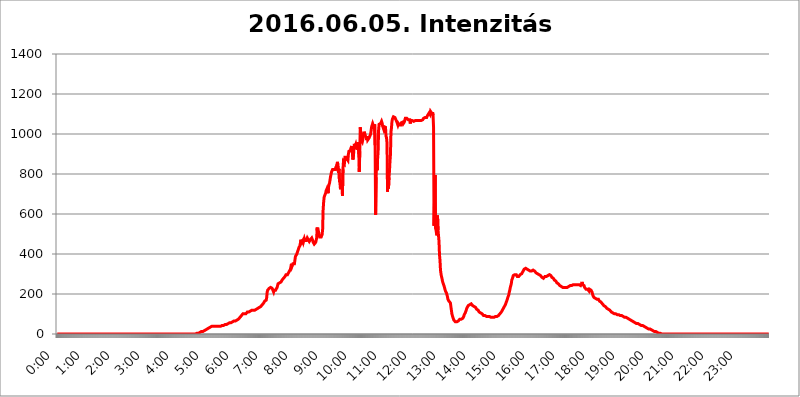
| Category | 2016.06.05. Intenzitás [W/m^2] |
|---|---|
| 0.0 | 0 |
| 0.0006944444444444445 | 0 |
| 0.001388888888888889 | 0 |
| 0.0020833333333333333 | 0 |
| 0.002777777777777778 | 0 |
| 0.003472222222222222 | 0 |
| 0.004166666666666667 | 0 |
| 0.004861111111111111 | 0 |
| 0.005555555555555556 | 0 |
| 0.0062499999999999995 | 0 |
| 0.006944444444444444 | 0 |
| 0.007638888888888889 | 0 |
| 0.008333333333333333 | 0 |
| 0.009027777777777779 | 0 |
| 0.009722222222222222 | 0 |
| 0.010416666666666666 | 0 |
| 0.011111111111111112 | 0 |
| 0.011805555555555555 | 0 |
| 0.012499999999999999 | 0 |
| 0.013194444444444444 | 0 |
| 0.013888888888888888 | 0 |
| 0.014583333333333332 | 0 |
| 0.015277777777777777 | 0 |
| 0.015972222222222224 | 0 |
| 0.016666666666666666 | 0 |
| 0.017361111111111112 | 0 |
| 0.018055555555555557 | 0 |
| 0.01875 | 0 |
| 0.019444444444444445 | 0 |
| 0.02013888888888889 | 0 |
| 0.020833333333333332 | 0 |
| 0.02152777777777778 | 0 |
| 0.022222222222222223 | 0 |
| 0.02291666666666667 | 0 |
| 0.02361111111111111 | 0 |
| 0.024305555555555556 | 0 |
| 0.024999999999999998 | 0 |
| 0.025694444444444447 | 0 |
| 0.02638888888888889 | 0 |
| 0.027083333333333334 | 0 |
| 0.027777777777777776 | 0 |
| 0.02847222222222222 | 0 |
| 0.029166666666666664 | 0 |
| 0.029861111111111113 | 0 |
| 0.030555555555555555 | 0 |
| 0.03125 | 0 |
| 0.03194444444444445 | 0 |
| 0.03263888888888889 | 0 |
| 0.03333333333333333 | 0 |
| 0.034027777777777775 | 0 |
| 0.034722222222222224 | 0 |
| 0.035416666666666666 | 0 |
| 0.036111111111111115 | 0 |
| 0.03680555555555556 | 0 |
| 0.0375 | 0 |
| 0.03819444444444444 | 0 |
| 0.03888888888888889 | 0 |
| 0.03958333333333333 | 0 |
| 0.04027777777777778 | 0 |
| 0.04097222222222222 | 0 |
| 0.041666666666666664 | 0 |
| 0.042361111111111106 | 0 |
| 0.04305555555555556 | 0 |
| 0.043750000000000004 | 0 |
| 0.044444444444444446 | 0 |
| 0.04513888888888889 | 0 |
| 0.04583333333333334 | 0 |
| 0.04652777777777778 | 0 |
| 0.04722222222222222 | 0 |
| 0.04791666666666666 | 0 |
| 0.04861111111111111 | 0 |
| 0.049305555555555554 | 0 |
| 0.049999999999999996 | 0 |
| 0.05069444444444445 | 0 |
| 0.051388888888888894 | 0 |
| 0.052083333333333336 | 0 |
| 0.05277777777777778 | 0 |
| 0.05347222222222222 | 0 |
| 0.05416666666666667 | 0 |
| 0.05486111111111111 | 0 |
| 0.05555555555555555 | 0 |
| 0.05625 | 0 |
| 0.05694444444444444 | 0 |
| 0.057638888888888885 | 0 |
| 0.05833333333333333 | 0 |
| 0.05902777777777778 | 0 |
| 0.059722222222222225 | 0 |
| 0.06041666666666667 | 0 |
| 0.061111111111111116 | 0 |
| 0.06180555555555556 | 0 |
| 0.0625 | 0 |
| 0.06319444444444444 | 0 |
| 0.06388888888888888 | 0 |
| 0.06458333333333334 | 0 |
| 0.06527777777777778 | 0 |
| 0.06597222222222222 | 0 |
| 0.06666666666666667 | 0 |
| 0.06736111111111111 | 0 |
| 0.06805555555555555 | 0 |
| 0.06874999999999999 | 0 |
| 0.06944444444444443 | 0 |
| 0.07013888888888889 | 0 |
| 0.07083333333333333 | 0 |
| 0.07152777777777779 | 0 |
| 0.07222222222222223 | 0 |
| 0.07291666666666667 | 0 |
| 0.07361111111111111 | 0 |
| 0.07430555555555556 | 0 |
| 0.075 | 0 |
| 0.07569444444444444 | 0 |
| 0.0763888888888889 | 0 |
| 0.07708333333333334 | 0 |
| 0.07777777777777778 | 0 |
| 0.07847222222222222 | 0 |
| 0.07916666666666666 | 0 |
| 0.0798611111111111 | 0 |
| 0.08055555555555556 | 0 |
| 0.08125 | 0 |
| 0.08194444444444444 | 0 |
| 0.08263888888888889 | 0 |
| 0.08333333333333333 | 0 |
| 0.08402777777777777 | 0 |
| 0.08472222222222221 | 0 |
| 0.08541666666666665 | 0 |
| 0.08611111111111112 | 0 |
| 0.08680555555555557 | 0 |
| 0.08750000000000001 | 0 |
| 0.08819444444444445 | 0 |
| 0.08888888888888889 | 0 |
| 0.08958333333333333 | 0 |
| 0.09027777777777778 | 0 |
| 0.09097222222222222 | 0 |
| 0.09166666666666667 | 0 |
| 0.09236111111111112 | 0 |
| 0.09305555555555556 | 0 |
| 0.09375 | 0 |
| 0.09444444444444444 | 0 |
| 0.09513888888888888 | 0 |
| 0.09583333333333333 | 0 |
| 0.09652777777777777 | 0 |
| 0.09722222222222222 | 0 |
| 0.09791666666666667 | 0 |
| 0.09861111111111111 | 0 |
| 0.09930555555555555 | 0 |
| 0.09999999999999999 | 0 |
| 0.10069444444444443 | 0 |
| 0.1013888888888889 | 0 |
| 0.10208333333333335 | 0 |
| 0.10277777777777779 | 0 |
| 0.10347222222222223 | 0 |
| 0.10416666666666667 | 0 |
| 0.10486111111111111 | 0 |
| 0.10555555555555556 | 0 |
| 0.10625 | 0 |
| 0.10694444444444444 | 0 |
| 0.1076388888888889 | 0 |
| 0.10833333333333334 | 0 |
| 0.10902777777777778 | 0 |
| 0.10972222222222222 | 0 |
| 0.1111111111111111 | 0 |
| 0.11180555555555556 | 0 |
| 0.11180555555555556 | 0 |
| 0.1125 | 0 |
| 0.11319444444444444 | 0 |
| 0.11388888888888889 | 0 |
| 0.11458333333333333 | 0 |
| 0.11527777777777777 | 0 |
| 0.11597222222222221 | 0 |
| 0.11666666666666665 | 0 |
| 0.1173611111111111 | 0 |
| 0.11805555555555557 | 0 |
| 0.11944444444444445 | 0 |
| 0.12013888888888889 | 0 |
| 0.12083333333333333 | 0 |
| 0.12152777777777778 | 0 |
| 0.12222222222222223 | 0 |
| 0.12291666666666667 | 0 |
| 0.12291666666666667 | 0 |
| 0.12361111111111112 | 0 |
| 0.12430555555555556 | 0 |
| 0.125 | 0 |
| 0.12569444444444444 | 0 |
| 0.12638888888888888 | 0 |
| 0.12708333333333333 | 0 |
| 0.16875 | 0 |
| 0.12847222222222224 | 0 |
| 0.12916666666666668 | 0 |
| 0.12986111111111112 | 0 |
| 0.13055555555555556 | 0 |
| 0.13125 | 0 |
| 0.13194444444444445 | 0 |
| 0.1326388888888889 | 0 |
| 0.13333333333333333 | 0 |
| 0.13402777777777777 | 0 |
| 0.13402777777777777 | 0 |
| 0.13472222222222222 | 0 |
| 0.13541666666666666 | 0 |
| 0.1361111111111111 | 0 |
| 0.13749999999999998 | 0 |
| 0.13819444444444443 | 0 |
| 0.1388888888888889 | 0 |
| 0.13958333333333334 | 0 |
| 0.14027777777777778 | 0 |
| 0.14097222222222222 | 0 |
| 0.14166666666666666 | 0 |
| 0.1423611111111111 | 0 |
| 0.14305555555555557 | 0 |
| 0.14375000000000002 | 0 |
| 0.14444444444444446 | 0 |
| 0.1451388888888889 | 0 |
| 0.1451388888888889 | 0 |
| 0.14652777777777778 | 0 |
| 0.14722222222222223 | 0 |
| 0.14791666666666667 | 0 |
| 0.1486111111111111 | 0 |
| 0.14930555555555555 | 0 |
| 0.15 | 0 |
| 0.15069444444444444 | 0 |
| 0.15138888888888888 | 0 |
| 0.15208333333333332 | 0 |
| 0.15277777777777776 | 0 |
| 0.15347222222222223 | 0 |
| 0.15416666666666667 | 0 |
| 0.15486111111111112 | 0 |
| 0.15555555555555556 | 0 |
| 0.15625 | 0 |
| 0.15694444444444444 | 0 |
| 0.15763888888888888 | 0 |
| 0.15833333333333333 | 0 |
| 0.15902777777777777 | 0 |
| 0.15972222222222224 | 0 |
| 0.16041666666666668 | 0 |
| 0.16111111111111112 | 0 |
| 0.16180555555555556 | 0 |
| 0.1625 | 0 |
| 0.16319444444444445 | 0 |
| 0.1638888888888889 | 0 |
| 0.16458333333333333 | 0 |
| 0.16527777777777777 | 0 |
| 0.16597222222222222 | 0 |
| 0.16666666666666666 | 0 |
| 0.1673611111111111 | 0 |
| 0.16805555555555554 | 0 |
| 0.16874999999999998 | 0 |
| 0.16944444444444443 | 0 |
| 0.17013888888888887 | 0 |
| 0.1708333333333333 | 0 |
| 0.17152777777777775 | 0 |
| 0.17222222222222225 | 0 |
| 0.1729166666666667 | 0 |
| 0.17361111111111113 | 0 |
| 0.17430555555555557 | 0 |
| 0.17500000000000002 | 0 |
| 0.17569444444444446 | 0 |
| 0.1763888888888889 | 0 |
| 0.17708333333333334 | 0 |
| 0.17777777777777778 | 0 |
| 0.17847222222222223 | 0 |
| 0.17916666666666667 | 0 |
| 0.1798611111111111 | 0 |
| 0.18055555555555555 | 0 |
| 0.18125 | 0 |
| 0.18194444444444444 | 0 |
| 0.1826388888888889 | 0 |
| 0.18333333333333335 | 0 |
| 0.1840277777777778 | 0 |
| 0.18472222222222223 | 0 |
| 0.18541666666666667 | 0 |
| 0.18611111111111112 | 0 |
| 0.18680555555555556 | 0 |
| 0.1875 | 0 |
| 0.18819444444444444 | 0 |
| 0.18888888888888888 | 0 |
| 0.18958333333333333 | 0 |
| 0.19027777777777777 | 0 |
| 0.1909722222222222 | 0 |
| 0.19166666666666665 | 0 |
| 0.19236111111111112 | 0 |
| 0.19305555555555554 | 0 |
| 0.19375 | 0 |
| 0.19444444444444445 | 0 |
| 0.1951388888888889 | 3.525 |
| 0.19583333333333333 | 3.525 |
| 0.19652777777777777 | 3.525 |
| 0.19722222222222222 | 3.525 |
| 0.19791666666666666 | 3.525 |
| 0.1986111111111111 | 3.525 |
| 0.19930555555555554 | 3.525 |
| 0.19999999999999998 | 7.887 |
| 0.20069444444444443 | 7.887 |
| 0.20138888888888887 | 7.887 |
| 0.2020833333333333 | 12.257 |
| 0.2027777777777778 | 12.257 |
| 0.2034722222222222 | 12.257 |
| 0.2041666666666667 | 12.257 |
| 0.20486111111111113 | 12.257 |
| 0.20555555555555557 | 16.636 |
| 0.20625000000000002 | 16.636 |
| 0.20694444444444446 | 16.636 |
| 0.2076388888888889 | 21.024 |
| 0.20833333333333334 | 21.024 |
| 0.20902777777777778 | 21.024 |
| 0.20972222222222223 | 21.024 |
| 0.21041666666666667 | 25.419 |
| 0.2111111111111111 | 25.419 |
| 0.21180555555555555 | 25.419 |
| 0.2125 | 29.823 |
| 0.21319444444444444 | 29.823 |
| 0.2138888888888889 | 29.823 |
| 0.21458333333333335 | 34.234 |
| 0.2152777777777778 | 34.234 |
| 0.21597222222222223 | 34.234 |
| 0.21666666666666667 | 38.653 |
| 0.21736111111111112 | 38.653 |
| 0.21805555555555556 | 38.653 |
| 0.21875 | 38.653 |
| 0.21944444444444444 | 38.653 |
| 0.22013888888888888 | 38.653 |
| 0.22083333333333333 | 38.653 |
| 0.22152777777777777 | 38.653 |
| 0.2222222222222222 | 38.653 |
| 0.22291666666666665 | 38.653 |
| 0.2236111111111111 | 38.653 |
| 0.22430555555555556 | 38.653 |
| 0.225 | 38.653 |
| 0.22569444444444445 | 38.653 |
| 0.2263888888888889 | 38.653 |
| 0.22708333333333333 | 38.653 |
| 0.22777777777777777 | 38.653 |
| 0.22847222222222222 | 38.653 |
| 0.22916666666666666 | 38.653 |
| 0.2298611111111111 | 38.653 |
| 0.23055555555555554 | 38.653 |
| 0.23124999999999998 | 43.079 |
| 0.23194444444444443 | 43.079 |
| 0.23263888888888887 | 43.079 |
| 0.2333333333333333 | 43.079 |
| 0.2340277777777778 | 43.079 |
| 0.2347222222222222 | 43.079 |
| 0.2354166666666667 | 47.511 |
| 0.23611111111111113 | 47.511 |
| 0.23680555555555557 | 47.511 |
| 0.23750000000000002 | 47.511 |
| 0.23819444444444446 | 51.951 |
| 0.2388888888888889 | 51.951 |
| 0.23958333333333334 | 51.951 |
| 0.24027777777777778 | 51.951 |
| 0.24097222222222223 | 56.398 |
| 0.24166666666666667 | 56.398 |
| 0.2423611111111111 | 56.398 |
| 0.24305555555555555 | 56.398 |
| 0.24375 | 56.398 |
| 0.24444444444444446 | 56.398 |
| 0.24513888888888888 | 60.85 |
| 0.24583333333333335 | 60.85 |
| 0.2465277777777778 | 60.85 |
| 0.24722222222222223 | 60.85 |
| 0.24791666666666667 | 65.31 |
| 0.24861111111111112 | 65.31 |
| 0.24930555555555556 | 65.31 |
| 0.25 | 65.31 |
| 0.25069444444444444 | 65.31 |
| 0.2513888888888889 | 65.31 |
| 0.2520833333333333 | 69.775 |
| 0.25277777777777777 | 69.775 |
| 0.2534722222222222 | 74.246 |
| 0.25416666666666665 | 74.246 |
| 0.2548611111111111 | 78.722 |
| 0.2555555555555556 | 78.722 |
| 0.25625000000000003 | 83.205 |
| 0.2569444444444445 | 83.205 |
| 0.2576388888888889 | 87.692 |
| 0.25833333333333336 | 92.184 |
| 0.2590277777777778 | 92.184 |
| 0.25972222222222224 | 96.682 |
| 0.2604166666666667 | 101.184 |
| 0.2611111111111111 | 101.184 |
| 0.26180555555555557 | 105.69 |
| 0.2625 | 101.184 |
| 0.26319444444444445 | 101.184 |
| 0.2638888888888889 | 101.184 |
| 0.26458333333333334 | 101.184 |
| 0.2652777777777778 | 105.69 |
| 0.2659722222222222 | 105.69 |
| 0.26666666666666666 | 110.201 |
| 0.2673611111111111 | 110.201 |
| 0.26805555555555555 | 110.201 |
| 0.26875 | 110.201 |
| 0.26944444444444443 | 114.716 |
| 0.2701388888888889 | 114.716 |
| 0.2708333333333333 | 114.716 |
| 0.27152777777777776 | 119.235 |
| 0.2722222222222222 | 119.235 |
| 0.27291666666666664 | 119.235 |
| 0.2736111111111111 | 119.235 |
| 0.2743055555555555 | 119.235 |
| 0.27499999999999997 | 119.235 |
| 0.27569444444444446 | 119.235 |
| 0.27638888888888885 | 119.235 |
| 0.27708333333333335 | 119.235 |
| 0.2777777777777778 | 119.235 |
| 0.27847222222222223 | 119.235 |
| 0.2791666666666667 | 123.758 |
| 0.2798611111111111 | 123.758 |
| 0.28055555555555556 | 128.284 |
| 0.28125 | 128.284 |
| 0.28194444444444444 | 128.284 |
| 0.2826388888888889 | 128.284 |
| 0.2833333333333333 | 132.814 |
| 0.28402777777777777 | 132.814 |
| 0.2847222222222222 | 137.347 |
| 0.28541666666666665 | 137.347 |
| 0.28611111111111115 | 141.884 |
| 0.28680555555555554 | 141.884 |
| 0.28750000000000003 | 146.423 |
| 0.2881944444444445 | 146.423 |
| 0.2888888888888889 | 150.964 |
| 0.28958333333333336 | 155.509 |
| 0.2902777777777778 | 155.509 |
| 0.29097222222222224 | 164.605 |
| 0.2916666666666667 | 160.056 |
| 0.2923611111111111 | 164.605 |
| 0.29305555555555557 | 169.156 |
| 0.29375 | 182.82 |
| 0.29444444444444445 | 210.182 |
| 0.2951388888888889 | 219.309 |
| 0.29583333333333334 | 219.309 |
| 0.2965277777777778 | 223.873 |
| 0.2972222222222222 | 228.436 |
| 0.29791666666666666 | 233 |
| 0.2986111111111111 | 233 |
| 0.29930555555555555 | 233 |
| 0.3 | 228.436 |
| 0.30069444444444443 | 228.436 |
| 0.3013888888888889 | 228.436 |
| 0.3020833333333333 | 228.436 |
| 0.30277777777777776 | 223.873 |
| 0.3034722222222222 | 210.182 |
| 0.30416666666666664 | 219.309 |
| 0.3048611111111111 | 214.746 |
| 0.3055555555555555 | 219.309 |
| 0.30624999999999997 | 219.309 |
| 0.3069444444444444 | 219.309 |
| 0.3076388888888889 | 223.873 |
| 0.30833333333333335 | 233 |
| 0.3090277777777778 | 242.127 |
| 0.30972222222222223 | 251.251 |
| 0.3104166666666667 | 255.813 |
| 0.3111111111111111 | 255.813 |
| 0.31180555555555556 | 255.813 |
| 0.3125 | 255.813 |
| 0.31319444444444444 | 255.813 |
| 0.3138888888888889 | 260.373 |
| 0.3145833333333333 | 264.932 |
| 0.31527777777777777 | 269.49 |
| 0.3159722222222222 | 274.047 |
| 0.31666666666666665 | 274.047 |
| 0.31736111111111115 | 278.603 |
| 0.31805555555555554 | 278.603 |
| 0.31875000000000003 | 283.156 |
| 0.3194444444444445 | 287.709 |
| 0.3201388888888889 | 292.259 |
| 0.32083333333333336 | 296.808 |
| 0.3215277777777778 | 296.808 |
| 0.32222222222222224 | 296.808 |
| 0.3229166666666667 | 296.808 |
| 0.3236111111111111 | 301.354 |
| 0.32430555555555557 | 305.898 |
| 0.325 | 305.898 |
| 0.32569444444444445 | 314.98 |
| 0.3263888888888889 | 319.517 |
| 0.32708333333333334 | 324.052 |
| 0.3277777777777778 | 337.639 |
| 0.3284722222222222 | 351.198 |
| 0.32916666666666666 | 337.639 |
| 0.3298611111111111 | 342.162 |
| 0.33055555555555555 | 351.198 |
| 0.33125 | 351.198 |
| 0.33194444444444443 | 351.198 |
| 0.3326388888888889 | 351.198 |
| 0.3333333333333333 | 369.23 |
| 0.3340277777777778 | 387.202 |
| 0.3347222222222222 | 391.685 |
| 0.3354166666666667 | 387.202 |
| 0.3361111111111111 | 400.638 |
| 0.3368055555555556 | 409.574 |
| 0.33749999999999997 | 414.035 |
| 0.33819444444444446 | 422.943 |
| 0.33888888888888885 | 431.833 |
| 0.33958333333333335 | 436.27 |
| 0.34027777777777773 | 440.702 |
| 0.34097222222222223 | 453.968 |
| 0.3416666666666666 | 471.582 |
| 0.3423611111111111 | 471.582 |
| 0.3430555555555555 | 458.38 |
| 0.34375 | 458.38 |
| 0.3444444444444445 | 467.187 |
| 0.3451388888888889 | 458.38 |
| 0.3458333333333334 | 462.786 |
| 0.34652777777777777 | 475.972 |
| 0.34722222222222227 | 467.187 |
| 0.34791666666666665 | 462.786 |
| 0.34861111111111115 | 462.786 |
| 0.34930555555555554 | 467.187 |
| 0.35000000000000003 | 471.582 |
| 0.3506944444444444 | 480.356 |
| 0.3513888888888889 | 475.972 |
| 0.3520833333333333 | 471.582 |
| 0.3527777777777778 | 471.582 |
| 0.3534722222222222 | 462.786 |
| 0.3541666666666667 | 462.786 |
| 0.3548611111111111 | 471.582 |
| 0.35555555555555557 | 467.187 |
| 0.35625 | 471.582 |
| 0.35694444444444445 | 480.356 |
| 0.3576388888888889 | 475.972 |
| 0.35833333333333334 | 467.187 |
| 0.3590277777777778 | 458.38 |
| 0.3597222222222222 | 453.968 |
| 0.36041666666666666 | 449.551 |
| 0.3611111111111111 | 449.551 |
| 0.36180555555555555 | 449.551 |
| 0.3625 | 458.38 |
| 0.36319444444444443 | 462.786 |
| 0.3638888888888889 | 480.356 |
| 0.3645833333333333 | 532.513 |
| 0.3652777777777778 | 493.475 |
| 0.3659722222222222 | 493.475 |
| 0.3666666666666667 | 506.542 |
| 0.3673611111111111 | 493.475 |
| 0.3680555555555556 | 484.735 |
| 0.36874999999999997 | 480.356 |
| 0.36944444444444446 | 480.356 |
| 0.37013888888888885 | 484.735 |
| 0.37083333333333335 | 489.108 |
| 0.37152777777777773 | 497.836 |
| 0.37222222222222223 | 523.88 |
| 0.3729166666666666 | 621.613 |
| 0.3736111111111111 | 658.909 |
| 0.3743055555555555 | 683.473 |
| 0.375 | 691.608 |
| 0.3756944444444445 | 695.666 |
| 0.3763888888888889 | 703.762 |
| 0.3770833333333334 | 715.858 |
| 0.37777777777777777 | 715.858 |
| 0.37847222222222227 | 727.896 |
| 0.37916666666666665 | 719.877 |
| 0.37986111111111115 | 703.762 |
| 0.38055555555555554 | 735.89 |
| 0.38125000000000003 | 747.834 |
| 0.3819444444444444 | 755.766 |
| 0.3826388888888889 | 771.559 |
| 0.3833333333333333 | 787.258 |
| 0.3840277777777778 | 798.974 |
| 0.3847222222222222 | 810.641 |
| 0.3854166666666667 | 814.519 |
| 0.3861111111111111 | 822.26 |
| 0.38680555555555557 | 822.26 |
| 0.3875 | 826.123 |
| 0.38819444444444445 | 822.26 |
| 0.3888888888888889 | 822.26 |
| 0.38958333333333334 | 822.26 |
| 0.3902777777777778 | 822.26 |
| 0.3909722222222222 | 837.682 |
| 0.39166666666666666 | 829.981 |
| 0.3923611111111111 | 849.199 |
| 0.39305555555555555 | 860.676 |
| 0.39375 | 860.676 |
| 0.39444444444444443 | 806.757 |
| 0.3951388888888889 | 826.123 |
| 0.3958333333333333 | 763.674 |
| 0.3965277777777778 | 755.766 |
| 0.3972222222222222 | 723.889 |
| 0.3979166666666667 | 767.62 |
| 0.3986111111111111 | 767.62 |
| 0.3993055555555556 | 743.859 |
| 0.39999999999999997 | 691.608 |
| 0.40069444444444446 | 822.26 |
| 0.40138888888888885 | 860.676 |
| 0.40208333333333335 | 860.676 |
| 0.40277777777777773 | 853.029 |
| 0.40347222222222223 | 883.516 |
| 0.4041666666666666 | 883.516 |
| 0.4048611111111111 | 879.719 |
| 0.4055555555555555 | 883.516 |
| 0.40625 | 875.918 |
| 0.4069444444444445 | 872.114 |
| 0.4076388888888889 | 868.305 |
| 0.4083333333333334 | 898.668 |
| 0.40902777777777777 | 913.766 |
| 0.40972222222222227 | 909.996 |
| 0.41041666666666665 | 917.534 |
| 0.41111111111111115 | 917.534 |
| 0.41180555555555554 | 928.819 |
| 0.41250000000000003 | 928.819 |
| 0.4131944444444444 | 940.082 |
| 0.4138888888888889 | 906.223 |
| 0.4145833333333333 | 872.114 |
| 0.4152777777777778 | 883.516 |
| 0.4159722222222222 | 879.719 |
| 0.4166666666666667 | 951.327 |
| 0.4173611111111111 | 947.58 |
| 0.41805555555555557 | 940.082 |
| 0.41875 | 947.58 |
| 0.41944444444444445 | 936.33 |
| 0.4201388888888889 | 928.819 |
| 0.42083333333333334 | 955.071 |
| 0.4215277777777778 | 921.298 |
| 0.4222222222222222 | 958.814 |
| 0.42291666666666666 | 898.668 |
| 0.4236111111111111 | 810.641 |
| 0.42430555555555555 | 913.766 |
| 0.425 | 1033.537 |
| 0.42569444444444443 | 1003.65 |
| 0.4263888888888889 | 966.295 |
| 0.4270833333333333 | 970.034 |
| 0.4277777777777778 | 958.814 |
| 0.4284722222222222 | 970.034 |
| 0.4291666666666667 | 1003.65 |
| 0.4298611111111111 | 996.182 |
| 0.4305555555555556 | 1011.118 |
| 0.43124999999999997 | 1003.65 |
| 0.43194444444444446 | 1007.383 |
| 0.43263888888888885 | 984.98 |
| 0.43333333333333335 | 977.508 |
| 0.43402777777777773 | 970.034 |
| 0.43472222222222223 | 988.714 |
| 0.4354166666666666 | 970.034 |
| 0.4361111111111111 | 970.034 |
| 0.4368055555555555 | 973.772 |
| 0.4375 | 981.244 |
| 0.4381944444444445 | 977.508 |
| 0.4388888888888889 | 981.244 |
| 0.4395833333333334 | 999.916 |
| 0.44027777777777777 | 999.916 |
| 0.44097222222222227 | 1037.277 |
| 0.44166666666666665 | 1033.537 |
| 0.44236111111111115 | 1052.255 |
| 0.44305555555555554 | 1048.508 |
| 0.44375000000000003 | 1037.277 |
| 0.4444444444444444 | 1041.019 |
| 0.4451388888888889 | 1048.508 |
| 0.4458333333333333 | 943.832 |
| 0.4465277777777778 | 596.45 |
| 0.4472222222222222 | 783.342 |
| 0.4479166666666667 | 860.676 |
| 0.4486111111111111 | 818.392 |
| 0.44930555555555557 | 875.918 |
| 0.45 | 909.996 |
| 0.45069444444444445 | 1018.587 |
| 0.4513888888888889 | 1048.508 |
| 0.45208333333333334 | 1052.255 |
| 0.4527777777777778 | 1052.255 |
| 0.4534722222222222 | 1052.255 |
| 0.45416666666666666 | 1056.004 |
| 0.4548611111111111 | 1063.51 |
| 0.45555555555555555 | 1056.004 |
| 0.45625 | 1041.019 |
| 0.45694444444444443 | 1037.277 |
| 0.4576388888888889 | 1026.06 |
| 0.4583333333333333 | 1037.277 |
| 0.4590277777777778 | 1033.537 |
| 0.4597222222222222 | 1033.537 |
| 0.4604166666666667 | 1033.537 |
| 0.4611111111111111 | 988.714 |
| 0.4618055555555556 | 981.244 |
| 0.46249999999999997 | 955.071 |
| 0.46319444444444446 | 711.832 |
| 0.46388888888888885 | 771.559 |
| 0.46458333333333335 | 727.896 |
| 0.46527777777777773 | 783.342 |
| 0.46597222222222223 | 814.519 |
| 0.4666666666666666 | 864.493 |
| 0.4673611111111111 | 898.668 |
| 0.4680555555555555 | 1011.118 |
| 0.46875 | 1029.798 |
| 0.4694444444444445 | 1063.51 |
| 0.4701388888888889 | 1074.789 |
| 0.4708333333333334 | 1074.789 |
| 0.47152777777777777 | 1086.097 |
| 0.47222222222222227 | 1086.097 |
| 0.47291666666666665 | 1086.097 |
| 0.47361111111111115 | 1082.324 |
| 0.47430555555555554 | 1078.555 |
| 0.47500000000000003 | 1071.027 |
| 0.4756944444444444 | 1067.267 |
| 0.4763888888888889 | 1059.756 |
| 0.4770833333333333 | 1056.004 |
| 0.4777777777777778 | 1044.762 |
| 0.4784722222222222 | 1052.255 |
| 0.4791666666666667 | 1052.255 |
| 0.4798611111111111 | 1044.762 |
| 0.48055555555555557 | 1048.508 |
| 0.48125 | 1041.019 |
| 0.48194444444444445 | 1044.762 |
| 0.4826388888888889 | 1056.004 |
| 0.48333333333333334 | 1059.756 |
| 0.4840277777777778 | 1059.756 |
| 0.4847222222222222 | 1059.756 |
| 0.48541666666666666 | 1052.255 |
| 0.4861111111111111 | 1056.004 |
| 0.48680555555555555 | 1059.756 |
| 0.4875 | 1059.756 |
| 0.48819444444444443 | 1078.555 |
| 0.4888888888888889 | 1078.555 |
| 0.4895833333333333 | 1078.555 |
| 0.4902777777777778 | 1078.555 |
| 0.4909722222222222 | 1078.555 |
| 0.4916666666666667 | 1078.555 |
| 0.4923611111111111 | 1071.027 |
| 0.4930555555555556 | 1067.267 |
| 0.49374999999999997 | 1074.789 |
| 0.49444444444444446 | 1071.027 |
| 0.49513888888888885 | 1052.255 |
| 0.49583333333333335 | 1067.267 |
| 0.49652777777777773 | 1063.51 |
| 0.49722222222222223 | 1063.51 |
| 0.4979166666666666 | 1067.267 |
| 0.4986111111111111 | 1067.267 |
| 0.4993055555555555 | 1067.267 |
| 0.5 | 1063.51 |
| 0.5006944444444444 | 1067.267 |
| 0.5013888888888889 | 1063.51 |
| 0.5020833333333333 | 1067.267 |
| 0.5027777777777778 | 1071.027 |
| 0.5034722222222222 | 1071.027 |
| 0.5041666666666667 | 1067.267 |
| 0.5048611111111111 | 1067.267 |
| 0.5055555555555555 | 1067.267 |
| 0.50625 | 1067.267 |
| 0.5069444444444444 | 1067.267 |
| 0.5076388888888889 | 1067.267 |
| 0.5083333333333333 | 1067.267 |
| 0.5090277777777777 | 1063.51 |
| 0.5097222222222222 | 1067.267 |
| 0.5104166666666666 | 1067.267 |
| 0.5111111111111112 | 1067.267 |
| 0.5118055555555555 | 1067.267 |
| 0.5125000000000001 | 1071.027 |
| 0.5131944444444444 | 1074.789 |
| 0.513888888888889 | 1078.555 |
| 0.5145833333333333 | 1082.324 |
| 0.5152777777777778 | 1082.324 |
| 0.5159722222222222 | 1082.324 |
| 0.5166666666666667 | 1086.097 |
| 0.517361111111111 | 1086.097 |
| 0.5180555555555556 | 1082.324 |
| 0.5187499999999999 | 1086.097 |
| 0.5194444444444445 | 1093.653 |
| 0.5201388888888888 | 1097.437 |
| 0.5208333333333334 | 1097.437 |
| 0.5215277777777778 | 1105.019 |
| 0.5222222222222223 | 1101.226 |
| 0.5229166666666667 | 1097.437 |
| 0.5236111111111111 | 1112.618 |
| 0.5243055555555556 | 1108.816 |
| 0.525 | 1105.019 |
| 0.5256944444444445 | 1093.653 |
| 0.5263888888888889 | 1108.816 |
| 0.5270833333333333 | 1093.653 |
| 0.5277777777777778 | 1033.537 |
| 0.5284722222222222 | 541.121 |
| 0.5291666666666667 | 541.121 |
| 0.5298611111111111 | 795.074 |
| 0.5305555555555556 | 528.2 |
| 0.53125 | 519.555 |
| 0.5319444444444444 | 502.192 |
| 0.5326388888888889 | 493.475 |
| 0.5333333333333333 | 592.233 |
| 0.5340277777777778 | 519.555 |
| 0.5347222222222222 | 493.475 |
| 0.5354166666666667 | 462.786 |
| 0.5361111111111111 | 396.164 |
| 0.5368055555555555 | 369.23 |
| 0.5375 | 319.517 |
| 0.5381944444444444 | 301.354 |
| 0.5388888888888889 | 287.709 |
| 0.5395833333333333 | 278.603 |
| 0.5402777777777777 | 264.932 |
| 0.5409722222222222 | 255.813 |
| 0.5416666666666666 | 251.251 |
| 0.5423611111111112 | 242.127 |
| 0.5430555555555555 | 233 |
| 0.5437500000000001 | 223.873 |
| 0.5444444444444444 | 214.746 |
| 0.545138888888889 | 210.182 |
| 0.5458333333333333 | 205.62 |
| 0.5465277777777778 | 196.497 |
| 0.5472222222222222 | 187.378 |
| 0.5479166666666667 | 173.709 |
| 0.548611111111111 | 169.156 |
| 0.5493055555555556 | 164.605 |
| 0.5499999999999999 | 164.605 |
| 0.5506944444444445 | 164.605 |
| 0.5513888888888888 | 155.509 |
| 0.5520833333333334 | 137.347 |
| 0.5527777777777778 | 119.235 |
| 0.5534722222222223 | 101.184 |
| 0.5541666666666667 | 92.184 |
| 0.5548611111111111 | 83.205 |
| 0.5555555555555556 | 78.722 |
| 0.55625 | 69.775 |
| 0.5569444444444445 | 65.31 |
| 0.5576388888888889 | 65.31 |
| 0.5583333333333333 | 60.85 |
| 0.5590277777777778 | 56.398 |
| 0.5597222222222222 | 60.85 |
| 0.5604166666666667 | 60.85 |
| 0.5611111111111111 | 60.85 |
| 0.5618055555555556 | 65.31 |
| 0.5625 | 65.31 |
| 0.5631944444444444 | 69.775 |
| 0.5638888888888889 | 69.775 |
| 0.5645833333333333 | 74.246 |
| 0.5652777777777778 | 74.246 |
| 0.5659722222222222 | 74.246 |
| 0.5666666666666667 | 74.246 |
| 0.5673611111111111 | 74.246 |
| 0.5680555555555555 | 78.722 |
| 0.56875 | 78.722 |
| 0.5694444444444444 | 83.205 |
| 0.5701388888888889 | 87.692 |
| 0.5708333333333333 | 96.682 |
| 0.5715277777777777 | 101.184 |
| 0.5722222222222222 | 105.69 |
| 0.5729166666666666 | 110.201 |
| 0.5736111111111112 | 119.235 |
| 0.5743055555555555 | 128.284 |
| 0.5750000000000001 | 132.814 |
| 0.5756944444444444 | 132.814 |
| 0.576388888888889 | 141.884 |
| 0.5770833333333333 | 146.423 |
| 0.5777777777777778 | 146.423 |
| 0.5784722222222222 | 146.423 |
| 0.5791666666666667 | 146.423 |
| 0.579861111111111 | 150.964 |
| 0.5805555555555556 | 150.964 |
| 0.5812499999999999 | 146.423 |
| 0.5819444444444445 | 146.423 |
| 0.5826388888888888 | 141.884 |
| 0.5833333333333334 | 141.884 |
| 0.5840277777777778 | 141.884 |
| 0.5847222222222223 | 137.347 |
| 0.5854166666666667 | 137.347 |
| 0.5861111111111111 | 132.814 |
| 0.5868055555555556 | 132.814 |
| 0.5875 | 128.284 |
| 0.5881944444444445 | 123.758 |
| 0.5888888888888889 | 119.235 |
| 0.5895833333333333 | 119.235 |
| 0.5902777777777778 | 119.235 |
| 0.5909722222222222 | 114.716 |
| 0.5916666666666667 | 110.201 |
| 0.5923611111111111 | 110.201 |
| 0.5930555555555556 | 110.201 |
| 0.59375 | 105.69 |
| 0.5944444444444444 | 101.184 |
| 0.5951388888888889 | 101.184 |
| 0.5958333333333333 | 101.184 |
| 0.5965277777777778 | 101.184 |
| 0.5972222222222222 | 96.682 |
| 0.5979166666666667 | 92.184 |
| 0.5986111111111111 | 92.184 |
| 0.5993055555555555 | 92.184 |
| 0.6 | 92.184 |
| 0.6006944444444444 | 92.184 |
| 0.6013888888888889 | 87.692 |
| 0.6020833333333333 | 87.692 |
| 0.6027777777777777 | 87.692 |
| 0.6034722222222222 | 87.692 |
| 0.6041666666666666 | 87.692 |
| 0.6048611111111112 | 87.692 |
| 0.6055555555555555 | 87.692 |
| 0.6062500000000001 | 87.692 |
| 0.6069444444444444 | 87.692 |
| 0.607638888888889 | 83.205 |
| 0.6083333333333333 | 83.205 |
| 0.6090277777777778 | 83.205 |
| 0.6097222222222222 | 83.205 |
| 0.6104166666666667 | 83.205 |
| 0.611111111111111 | 83.205 |
| 0.6118055555555556 | 83.205 |
| 0.6124999999999999 | 83.205 |
| 0.6131944444444445 | 83.205 |
| 0.6138888888888888 | 87.692 |
| 0.6145833333333334 | 87.692 |
| 0.6152777777777778 | 87.692 |
| 0.6159722222222223 | 87.692 |
| 0.6166666666666667 | 87.692 |
| 0.6173611111111111 | 92.184 |
| 0.6180555555555556 | 92.184 |
| 0.61875 | 92.184 |
| 0.6194444444444445 | 96.682 |
| 0.6201388888888889 | 96.682 |
| 0.6208333333333333 | 101.184 |
| 0.6215277777777778 | 101.184 |
| 0.6222222222222222 | 105.69 |
| 0.6229166666666667 | 110.201 |
| 0.6236111111111111 | 114.716 |
| 0.6243055555555556 | 119.235 |
| 0.625 | 123.758 |
| 0.6256944444444444 | 128.284 |
| 0.6263888888888889 | 132.814 |
| 0.6270833333333333 | 137.347 |
| 0.6277777777777778 | 141.884 |
| 0.6284722222222222 | 146.423 |
| 0.6291666666666667 | 150.964 |
| 0.6298611111111111 | 160.056 |
| 0.6305555555555555 | 164.605 |
| 0.63125 | 173.709 |
| 0.6319444444444444 | 182.82 |
| 0.6326388888888889 | 187.378 |
| 0.6333333333333333 | 196.497 |
| 0.6340277777777777 | 210.182 |
| 0.6347222222222222 | 219.309 |
| 0.6354166666666666 | 233 |
| 0.6361111111111112 | 237.564 |
| 0.6368055555555555 | 251.251 |
| 0.6375000000000001 | 269.49 |
| 0.6381944444444444 | 274.047 |
| 0.638888888888889 | 283.156 |
| 0.6395833333333333 | 292.259 |
| 0.6402777777777778 | 296.808 |
| 0.6409722222222222 | 296.808 |
| 0.6416666666666667 | 296.808 |
| 0.642361111111111 | 301.354 |
| 0.6430555555555556 | 301.354 |
| 0.6437499999999999 | 296.808 |
| 0.6444444444444445 | 292.259 |
| 0.6451388888888888 | 287.709 |
| 0.6458333333333334 | 287.709 |
| 0.6465277777777778 | 287.709 |
| 0.6472222222222223 | 287.709 |
| 0.6479166666666667 | 292.259 |
| 0.6486111111111111 | 292.259 |
| 0.6493055555555556 | 296.808 |
| 0.65 | 296.808 |
| 0.6506944444444445 | 301.354 |
| 0.6513888888888889 | 301.354 |
| 0.6520833333333333 | 305.898 |
| 0.6527777777777778 | 305.898 |
| 0.6534722222222222 | 314.98 |
| 0.6541666666666667 | 319.517 |
| 0.6548611111111111 | 324.052 |
| 0.6555555555555556 | 324.052 |
| 0.65625 | 328.584 |
| 0.6569444444444444 | 328.584 |
| 0.6576388888888889 | 328.584 |
| 0.6583333333333333 | 328.584 |
| 0.6590277777777778 | 324.052 |
| 0.6597222222222222 | 324.052 |
| 0.6604166666666667 | 319.517 |
| 0.6611111111111111 | 319.517 |
| 0.6618055555555555 | 314.98 |
| 0.6625 | 314.98 |
| 0.6631944444444444 | 314.98 |
| 0.6638888888888889 | 314.98 |
| 0.6645833333333333 | 314.98 |
| 0.6652777777777777 | 314.98 |
| 0.6659722222222222 | 314.98 |
| 0.6666666666666666 | 319.517 |
| 0.6673611111111111 | 319.517 |
| 0.6680555555555556 | 319.517 |
| 0.6687500000000001 | 314.98 |
| 0.6694444444444444 | 314.98 |
| 0.6701388888888888 | 310.44 |
| 0.6708333333333334 | 310.44 |
| 0.6715277777777778 | 305.898 |
| 0.6722222222222222 | 305.898 |
| 0.6729166666666666 | 301.354 |
| 0.6736111111111112 | 301.354 |
| 0.6743055555555556 | 301.354 |
| 0.6749999999999999 | 296.808 |
| 0.6756944444444444 | 296.808 |
| 0.6763888888888889 | 296.808 |
| 0.6770833333333334 | 292.259 |
| 0.6777777777777777 | 292.259 |
| 0.6784722222222223 | 292.259 |
| 0.6791666666666667 | 287.709 |
| 0.6798611111111111 | 283.156 |
| 0.6805555555555555 | 278.603 |
| 0.68125 | 278.603 |
| 0.6819444444444445 | 278.603 |
| 0.6826388888888889 | 283.156 |
| 0.6833333333333332 | 283.156 |
| 0.6840277777777778 | 287.709 |
| 0.6847222222222222 | 287.709 |
| 0.6854166666666667 | 287.709 |
| 0.686111111111111 | 287.709 |
| 0.6868055555555556 | 292.259 |
| 0.6875 | 292.259 |
| 0.6881944444444444 | 292.259 |
| 0.688888888888889 | 292.259 |
| 0.6895833333333333 | 292.259 |
| 0.6902777777777778 | 296.808 |
| 0.6909722222222222 | 292.259 |
| 0.6916666666666668 | 292.259 |
| 0.6923611111111111 | 292.259 |
| 0.6930555555555555 | 287.709 |
| 0.69375 | 283.156 |
| 0.6944444444444445 | 283.156 |
| 0.6951388888888889 | 278.603 |
| 0.6958333333333333 | 278.603 |
| 0.6965277777777777 | 274.047 |
| 0.6972222222222223 | 269.49 |
| 0.6979166666666666 | 269.49 |
| 0.6986111111111111 | 264.932 |
| 0.6993055555555556 | 264.932 |
| 0.7000000000000001 | 260.373 |
| 0.7006944444444444 | 255.813 |
| 0.7013888888888888 | 255.813 |
| 0.7020833333333334 | 251.251 |
| 0.7027777777777778 | 251.251 |
| 0.7034722222222222 | 246.689 |
| 0.7041666666666666 | 246.689 |
| 0.7048611111111112 | 242.127 |
| 0.7055555555555556 | 242.127 |
| 0.7062499999999999 | 242.127 |
| 0.7069444444444444 | 237.564 |
| 0.7076388888888889 | 237.564 |
| 0.7083333333333334 | 233 |
| 0.7090277777777777 | 233 |
| 0.7097222222222223 | 233 |
| 0.7104166666666667 | 233 |
| 0.7111111111111111 | 233 |
| 0.7118055555555555 | 233 |
| 0.7125 | 233 |
| 0.7131944444444445 | 233 |
| 0.7138888888888889 | 233 |
| 0.7145833333333332 | 233 |
| 0.7152777777777778 | 233 |
| 0.7159722222222222 | 233 |
| 0.7166666666666667 | 237.564 |
| 0.717361111111111 | 237.564 |
| 0.7180555555555556 | 237.564 |
| 0.71875 | 237.564 |
| 0.7194444444444444 | 242.127 |
| 0.720138888888889 | 242.127 |
| 0.7208333333333333 | 242.127 |
| 0.7215277777777778 | 242.127 |
| 0.7222222222222222 | 242.127 |
| 0.7229166666666668 | 246.689 |
| 0.7236111111111111 | 246.689 |
| 0.7243055555555555 | 246.689 |
| 0.725 | 246.689 |
| 0.7256944444444445 | 246.689 |
| 0.7263888888888889 | 246.689 |
| 0.7270833333333333 | 246.689 |
| 0.7277777777777777 | 246.689 |
| 0.7284722222222223 | 246.689 |
| 0.7291666666666666 | 246.689 |
| 0.7298611111111111 | 246.689 |
| 0.7305555555555556 | 246.689 |
| 0.7312500000000001 | 246.689 |
| 0.7319444444444444 | 246.689 |
| 0.7326388888888888 | 242.127 |
| 0.7333333333333334 | 242.127 |
| 0.7340277777777778 | 242.127 |
| 0.7347222222222222 | 242.127 |
| 0.7354166666666666 | 251.251 |
| 0.7361111111111112 | 260.373 |
| 0.7368055555555556 | 246.689 |
| 0.7374999999999999 | 242.127 |
| 0.7381944444444444 | 242.127 |
| 0.7388888888888889 | 242.127 |
| 0.7395833333333334 | 233 |
| 0.7402777777777777 | 228.436 |
| 0.7409722222222223 | 228.436 |
| 0.7416666666666667 | 223.873 |
| 0.7423611111111111 | 223.873 |
| 0.7430555555555555 | 223.873 |
| 0.74375 | 223.873 |
| 0.7444444444444445 | 223.873 |
| 0.7451388888888889 | 219.309 |
| 0.7458333333333332 | 214.746 |
| 0.7465277777777778 | 223.873 |
| 0.7472222222222222 | 228.436 |
| 0.7479166666666667 | 223.873 |
| 0.748611111111111 | 219.309 |
| 0.7493055555555556 | 214.746 |
| 0.75 | 210.182 |
| 0.7506944444444444 | 201.058 |
| 0.751388888888889 | 191.937 |
| 0.7520833333333333 | 187.378 |
| 0.7527777777777778 | 182.82 |
| 0.7534722222222222 | 182.82 |
| 0.7541666666666668 | 178.264 |
| 0.7548611111111111 | 178.264 |
| 0.7555555555555555 | 178.264 |
| 0.75625 | 173.709 |
| 0.7569444444444445 | 173.709 |
| 0.7576388888888889 | 173.709 |
| 0.7583333333333333 | 173.709 |
| 0.7590277777777777 | 173.709 |
| 0.7597222222222223 | 169.156 |
| 0.7604166666666666 | 164.605 |
| 0.7611111111111111 | 164.605 |
| 0.7618055555555556 | 160.056 |
| 0.7625000000000001 | 160.056 |
| 0.7631944444444444 | 155.509 |
| 0.7638888888888888 | 155.509 |
| 0.7645833333333334 | 150.964 |
| 0.7652777777777778 | 146.423 |
| 0.7659722222222222 | 146.423 |
| 0.7666666666666666 | 141.884 |
| 0.7673611111111112 | 137.347 |
| 0.7680555555555556 | 137.347 |
| 0.7687499999999999 | 137.347 |
| 0.7694444444444444 | 132.814 |
| 0.7701388888888889 | 132.814 |
| 0.7708333333333334 | 128.284 |
| 0.7715277777777777 | 128.284 |
| 0.7722222222222223 | 128.284 |
| 0.7729166666666667 | 123.758 |
| 0.7736111111111111 | 123.758 |
| 0.7743055555555555 | 119.235 |
| 0.775 | 119.235 |
| 0.7756944444444445 | 119.235 |
| 0.7763888888888889 | 114.716 |
| 0.7770833333333332 | 110.201 |
| 0.7777777777777778 | 110.201 |
| 0.7784722222222222 | 105.69 |
| 0.7791666666666667 | 105.69 |
| 0.779861111111111 | 105.69 |
| 0.7805555555555556 | 101.184 |
| 0.78125 | 101.184 |
| 0.7819444444444444 | 101.184 |
| 0.782638888888889 | 101.184 |
| 0.7833333333333333 | 101.184 |
| 0.7840277777777778 | 101.184 |
| 0.7847222222222222 | 101.184 |
| 0.7854166666666668 | 96.682 |
| 0.7861111111111111 | 96.682 |
| 0.7868055555555555 | 96.682 |
| 0.7875 | 96.682 |
| 0.7881944444444445 | 96.682 |
| 0.7888888888888889 | 96.682 |
| 0.7895833333333333 | 92.184 |
| 0.7902777777777777 | 92.184 |
| 0.7909722222222223 | 92.184 |
| 0.7916666666666666 | 92.184 |
| 0.7923611111111111 | 92.184 |
| 0.7930555555555556 | 87.692 |
| 0.7937500000000001 | 87.692 |
| 0.7944444444444444 | 87.692 |
| 0.7951388888888888 | 87.692 |
| 0.7958333333333334 | 83.205 |
| 0.7965277777777778 | 83.205 |
| 0.7972222222222222 | 83.205 |
| 0.7979166666666666 | 83.205 |
| 0.7986111111111112 | 78.722 |
| 0.7993055555555556 | 78.722 |
| 0.7999999999999999 | 78.722 |
| 0.8006944444444444 | 74.246 |
| 0.8013888888888889 | 74.246 |
| 0.8020833333333334 | 74.246 |
| 0.8027777777777777 | 74.246 |
| 0.8034722222222223 | 74.246 |
| 0.8041666666666667 | 69.775 |
| 0.8048611111111111 | 69.775 |
| 0.8055555555555555 | 65.31 |
| 0.80625 | 65.31 |
| 0.8069444444444445 | 65.31 |
| 0.8076388888888889 | 60.85 |
| 0.8083333333333332 | 60.85 |
| 0.8090277777777778 | 60.85 |
| 0.8097222222222222 | 56.398 |
| 0.8104166666666667 | 56.398 |
| 0.811111111111111 | 56.398 |
| 0.8118055555555556 | 56.398 |
| 0.8125 | 51.951 |
| 0.8131944444444444 | 51.951 |
| 0.813888888888889 | 51.951 |
| 0.8145833333333333 | 51.951 |
| 0.8152777777777778 | 47.511 |
| 0.8159722222222222 | 47.511 |
| 0.8166666666666668 | 47.511 |
| 0.8173611111111111 | 47.511 |
| 0.8180555555555555 | 47.511 |
| 0.81875 | 43.079 |
| 0.8194444444444445 | 43.079 |
| 0.8201388888888889 | 43.079 |
| 0.8208333333333333 | 43.079 |
| 0.8215277777777777 | 38.653 |
| 0.8222222222222223 | 38.653 |
| 0.8229166666666666 | 38.653 |
| 0.8236111111111111 | 38.653 |
| 0.8243055555555556 | 38.653 |
| 0.8250000000000001 | 34.234 |
| 0.8256944444444444 | 34.234 |
| 0.8263888888888888 | 34.234 |
| 0.8270833333333334 | 29.823 |
| 0.8277777777777778 | 29.823 |
| 0.8284722222222222 | 29.823 |
| 0.8291666666666666 | 25.419 |
| 0.8298611111111112 | 25.419 |
| 0.8305555555555556 | 25.419 |
| 0.8312499999999999 | 25.419 |
| 0.8319444444444444 | 21.024 |
| 0.8326388888888889 | 21.024 |
| 0.8333333333333334 | 21.024 |
| 0.8340277777777777 | 21.024 |
| 0.8347222222222223 | 16.636 |
| 0.8354166666666667 | 16.636 |
| 0.8361111111111111 | 16.636 |
| 0.8368055555555555 | 16.636 |
| 0.8375 | 12.257 |
| 0.8381944444444445 | 12.257 |
| 0.8388888888888889 | 12.257 |
| 0.8395833333333332 | 12.257 |
| 0.8402777777777778 | 7.887 |
| 0.8409722222222222 | 7.887 |
| 0.8416666666666667 | 7.887 |
| 0.842361111111111 | 7.887 |
| 0.8430555555555556 | 3.525 |
| 0.84375 | 3.525 |
| 0.8444444444444444 | 3.525 |
| 0.845138888888889 | 3.525 |
| 0.8458333333333333 | 3.525 |
| 0.8465277777777778 | 0 |
| 0.8472222222222222 | 0 |
| 0.8479166666666668 | 0 |
| 0.8486111111111111 | 0 |
| 0.8493055555555555 | 0 |
| 0.85 | 0 |
| 0.8506944444444445 | 0 |
| 0.8513888888888889 | 0 |
| 0.8520833333333333 | 0 |
| 0.8527777777777777 | 0 |
| 0.8534722222222223 | 0 |
| 0.8541666666666666 | 0 |
| 0.8548611111111111 | 0 |
| 0.8555555555555556 | 0 |
| 0.8562500000000001 | 0 |
| 0.8569444444444444 | 0 |
| 0.8576388888888888 | 0 |
| 0.8583333333333334 | 0 |
| 0.8590277777777778 | 0 |
| 0.8597222222222222 | 0 |
| 0.8604166666666666 | 0 |
| 0.8611111111111112 | 0 |
| 0.8618055555555556 | 0 |
| 0.8624999999999999 | 0 |
| 0.8631944444444444 | 0 |
| 0.8638888888888889 | 0 |
| 0.8645833333333334 | 0 |
| 0.8652777777777777 | 0 |
| 0.8659722222222223 | 0 |
| 0.8666666666666667 | 0 |
| 0.8673611111111111 | 0 |
| 0.8680555555555555 | 0 |
| 0.86875 | 0 |
| 0.8694444444444445 | 0 |
| 0.8701388888888889 | 0 |
| 0.8708333333333332 | 0 |
| 0.8715277777777778 | 0 |
| 0.8722222222222222 | 0 |
| 0.8729166666666667 | 0 |
| 0.873611111111111 | 0 |
| 0.8743055555555556 | 0 |
| 0.875 | 0 |
| 0.8756944444444444 | 0 |
| 0.876388888888889 | 0 |
| 0.8770833333333333 | 0 |
| 0.8777777777777778 | 0 |
| 0.8784722222222222 | 0 |
| 0.8791666666666668 | 0 |
| 0.8798611111111111 | 0 |
| 0.8805555555555555 | 0 |
| 0.88125 | 0 |
| 0.8819444444444445 | 0 |
| 0.8826388888888889 | 0 |
| 0.8833333333333333 | 0 |
| 0.8840277777777777 | 0 |
| 0.8847222222222223 | 0 |
| 0.8854166666666666 | 0 |
| 0.8861111111111111 | 0 |
| 0.8868055555555556 | 0 |
| 0.8875000000000001 | 0 |
| 0.8881944444444444 | 0 |
| 0.8888888888888888 | 0 |
| 0.8895833333333334 | 0 |
| 0.8902777777777778 | 0 |
| 0.8909722222222222 | 0 |
| 0.8916666666666666 | 0 |
| 0.8923611111111112 | 0 |
| 0.8930555555555556 | 0 |
| 0.8937499999999999 | 0 |
| 0.8944444444444444 | 0 |
| 0.8951388888888889 | 0 |
| 0.8958333333333334 | 0 |
| 0.8965277777777777 | 0 |
| 0.8972222222222223 | 0 |
| 0.8979166666666667 | 0 |
| 0.8986111111111111 | 0 |
| 0.8993055555555555 | 0 |
| 0.9 | 0 |
| 0.9006944444444445 | 0 |
| 0.9013888888888889 | 0 |
| 0.9020833333333332 | 0 |
| 0.9027777777777778 | 0 |
| 0.9034722222222222 | 0 |
| 0.9041666666666667 | 0 |
| 0.904861111111111 | 0 |
| 0.9055555555555556 | 0 |
| 0.90625 | 0 |
| 0.9069444444444444 | 0 |
| 0.907638888888889 | 0 |
| 0.9083333333333333 | 0 |
| 0.9090277777777778 | 0 |
| 0.9097222222222222 | 0 |
| 0.9104166666666668 | 0 |
| 0.9111111111111111 | 0 |
| 0.9118055555555555 | 0 |
| 0.9125 | 0 |
| 0.9131944444444445 | 0 |
| 0.9138888888888889 | 0 |
| 0.9145833333333333 | 0 |
| 0.9152777777777777 | 0 |
| 0.9159722222222223 | 0 |
| 0.9166666666666666 | 0 |
| 0.9173611111111111 | 0 |
| 0.9180555555555556 | 0 |
| 0.9187500000000001 | 0 |
| 0.9194444444444444 | 0 |
| 0.9201388888888888 | 0 |
| 0.9208333333333334 | 0 |
| 0.9215277777777778 | 0 |
| 0.9222222222222222 | 0 |
| 0.9229166666666666 | 0 |
| 0.9236111111111112 | 0 |
| 0.9243055555555556 | 0 |
| 0.9249999999999999 | 0 |
| 0.9256944444444444 | 0 |
| 0.9263888888888889 | 0 |
| 0.9270833333333334 | 0 |
| 0.9277777777777777 | 0 |
| 0.9284722222222223 | 0 |
| 0.9291666666666667 | 0 |
| 0.9298611111111111 | 0 |
| 0.9305555555555555 | 0 |
| 0.93125 | 0 |
| 0.9319444444444445 | 0 |
| 0.9326388888888889 | 0 |
| 0.9333333333333332 | 0 |
| 0.9340277777777778 | 0 |
| 0.9347222222222222 | 0 |
| 0.9354166666666667 | 0 |
| 0.936111111111111 | 0 |
| 0.9368055555555556 | 0 |
| 0.9375 | 0 |
| 0.9381944444444444 | 0 |
| 0.938888888888889 | 0 |
| 0.9395833333333333 | 0 |
| 0.9402777777777778 | 0 |
| 0.9409722222222222 | 0 |
| 0.9416666666666668 | 0 |
| 0.9423611111111111 | 0 |
| 0.9430555555555555 | 0 |
| 0.94375 | 0 |
| 0.9444444444444445 | 0 |
| 0.9451388888888889 | 0 |
| 0.9458333333333333 | 0 |
| 0.9465277777777777 | 0 |
| 0.9472222222222223 | 0 |
| 0.9479166666666666 | 0 |
| 0.9486111111111111 | 0 |
| 0.9493055555555556 | 0 |
| 0.9500000000000001 | 0 |
| 0.9506944444444444 | 0 |
| 0.9513888888888888 | 0 |
| 0.9520833333333334 | 0 |
| 0.9527777777777778 | 0 |
| 0.9534722222222222 | 0 |
| 0.9541666666666666 | 0 |
| 0.9548611111111112 | 0 |
| 0.9555555555555556 | 0 |
| 0.9562499999999999 | 0 |
| 0.9569444444444444 | 0 |
| 0.9576388888888889 | 0 |
| 0.9583333333333334 | 0 |
| 0.9590277777777777 | 0 |
| 0.9597222222222223 | 0 |
| 0.9604166666666667 | 0 |
| 0.9611111111111111 | 0 |
| 0.9618055555555555 | 0 |
| 0.9625 | 0 |
| 0.9631944444444445 | 0 |
| 0.9638888888888889 | 0 |
| 0.9645833333333332 | 0 |
| 0.9652777777777778 | 0 |
| 0.9659722222222222 | 0 |
| 0.9666666666666667 | 0 |
| 0.967361111111111 | 0 |
| 0.9680555555555556 | 0 |
| 0.96875 | 0 |
| 0.9694444444444444 | 0 |
| 0.970138888888889 | 0 |
| 0.9708333333333333 | 0 |
| 0.9715277777777778 | 0 |
| 0.9722222222222222 | 0 |
| 0.9729166666666668 | 0 |
| 0.9736111111111111 | 0 |
| 0.9743055555555555 | 0 |
| 0.975 | 0 |
| 0.9756944444444445 | 0 |
| 0.9763888888888889 | 0 |
| 0.9770833333333333 | 0 |
| 0.9777777777777777 | 0 |
| 0.9784722222222223 | 0 |
| 0.9791666666666666 | 0 |
| 0.9798611111111111 | 0 |
| 0.9805555555555556 | 0 |
| 0.9812500000000001 | 0 |
| 0.9819444444444444 | 0 |
| 0.9826388888888888 | 0 |
| 0.9833333333333334 | 0 |
| 0.9840277777777778 | 0 |
| 0.9847222222222222 | 0 |
| 0.9854166666666666 | 0 |
| 0.9861111111111112 | 0 |
| 0.9868055555555556 | 0 |
| 0.9874999999999999 | 0 |
| 0.9881944444444444 | 0 |
| 0.9888888888888889 | 0 |
| 0.9895833333333334 | 0 |
| 0.9902777777777777 | 0 |
| 0.9909722222222223 | 0 |
| 0.9916666666666667 | 0 |
| 0.9923611111111111 | 0 |
| 0.9930555555555555 | 0 |
| 0.99375 | 0 |
| 0.9944444444444445 | 0 |
| 0.9951388888888889 | 0 |
| 0.9958333333333332 | 0 |
| 0.9965277777777778 | 0 |
| 0.9972222222222222 | 0 |
| 0.9979166666666667 | 0 |
| 0.998611111111111 | 0 |
| 0.9993055555555556 | 0 |